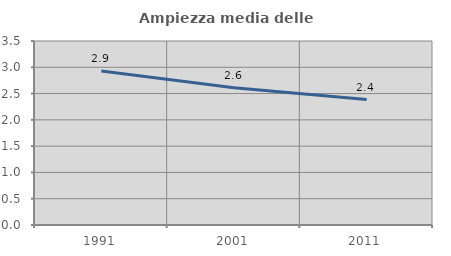
| Category | Ampiezza media delle famiglie |
|---|---|
| 1991.0 | 2.929 |
| 2001.0 | 2.612 |
| 2011.0 | 2.385 |